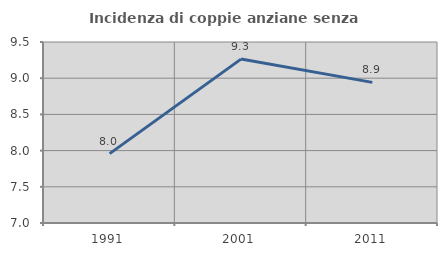
| Category | Incidenza di coppie anziane senza figli  |
|---|---|
| 1991.0 | 7.958 |
| 2001.0 | 9.264 |
| 2011.0 | 8.942 |